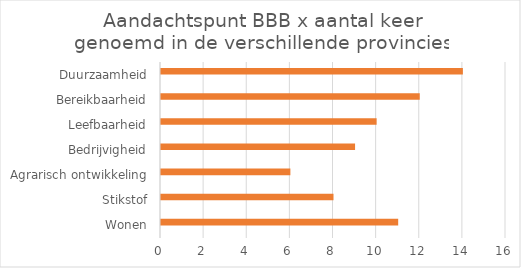
| Category | Series 0 | Series 1 |
|---|---|---|
| Wonen |  | 11 |
| Stikstof |  | 8 |
| Agrarisch ontwikkeling |  | 6 |
| Bedrijvigheid |  | 9 |
| Leefbaarheid |  | 10 |
| Bereikbaarheid |  | 12 |
| Duurzaamheid |  | 14 |